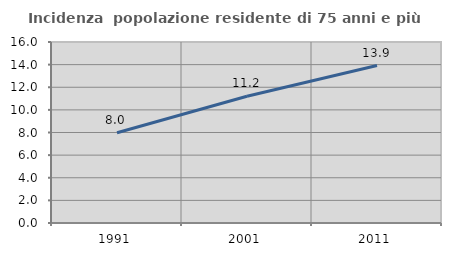
| Category | Incidenza  popolazione residente di 75 anni e più |
|---|---|
| 1991.0 | 7.974 |
| 2001.0 | 11.198 |
| 2011.0 | 13.92 |